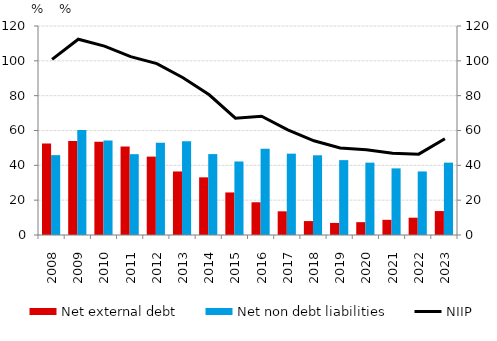
| Category | Net external debt | Net non debt liabilities |
|---|---|---|
| 2008.0 | 52.496 | 45.849 |
| 2009.0 | 53.975 | 60.318 |
| 2010.0 | 53.56 | 54.245 |
| 2011.0 | 50.774 | 46.406 |
| 2012.0 | 45.011 | 52.933 |
| 2013.0 | 36.475 | 53.831 |
| 2014.0 | 33.104 | 46.457 |
| 2015.0 | 24.432 | 42.223 |
| 2016.0 | 18.793 | 49.456 |
| 2017.0 | 13.599 | 46.702 |
| 2018.0 | 7.995 | 45.773 |
| 2019.0 | 6.936 | 42.989 |
| 2020.0 | 7.37 | 41.541 |
| 2021.0 | 8.714 | 38.248 |
| 2022.0 | 9.936 | 36.492 |
| 2023.0 | 13.746 | 41.551 |